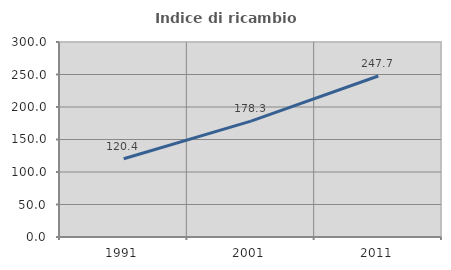
| Category | Indice di ricambio occupazionale  |
|---|---|
| 1991.0 | 120.36 |
| 2001.0 | 178.342 |
| 2011.0 | 247.704 |